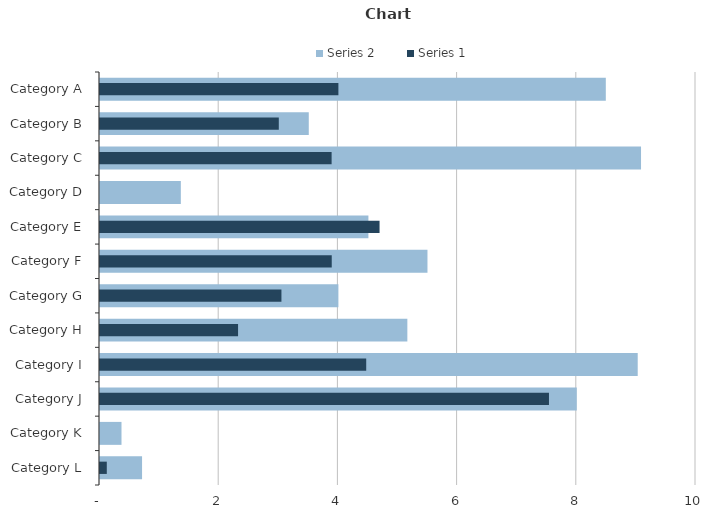
| Category | Series 2 |
|---|---|
| Category A | 8.487 |
| Category B | 3.503 |
| Category C | 9.078 |
| Category D | 1.356 |
| Category E | 4.503 |
| Category F | 5.494 |
| Category G | 4 |
| Category H | 5.157 |
| Category I | 9.022 |
| Category J | 8 |
| Category K | 0.361 |
| Category L | 0.706 |